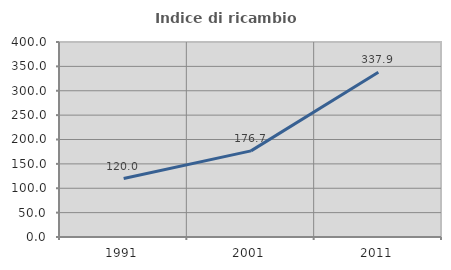
| Category | Indice di ricambio occupazionale  |
|---|---|
| 1991.0 | 120 |
| 2001.0 | 176.667 |
| 2011.0 | 337.931 |